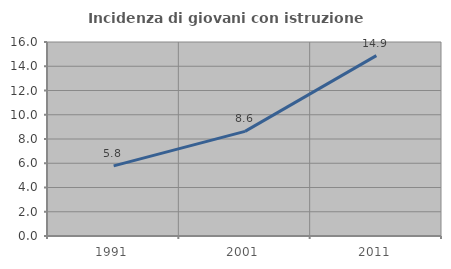
| Category | Incidenza di giovani con istruzione universitaria |
|---|---|
| 1991.0 | 5.786 |
| 2001.0 | 8.626 |
| 2011.0 | 14.873 |